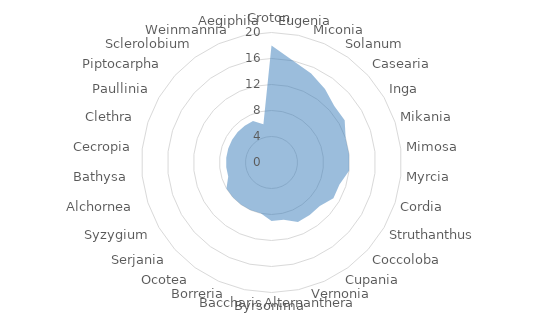
| Category | Series 0 |
|---|---|
| Croton | 18 |
| Eugenia | 16 |
| Miconia | 15 |
| Solanum | 14 |
| Casearia | 13 |
| Inga | 13 |
| Mikania | 12 |
| Mimosa | 12 |
| Myrcia | 12 |
| Cordia | 11 |
| Struthanthus | 11 |
| Coccoloba | 10 |
| Cupania | 10 |
| Vernonia | 10 |
| Alternanthera | 9 |
| Byrsonima | 9 |
| Baccharis | 8 |
| Borreria | 8 |
| Ocotea  | 8 |
| Serjania | 8 |
| Syzygium | 8 |
| Alchornea  | 7 |
| Bathysa  | 7 |
| Cecropia | 7 |
| Clethra  | 7 |
| Paullinia | 7 |
| Piptocarpha  | 7 |
| Sclerolobium  | 7 |
| Weinmannia  | 7 |
| Aegiphila  | 6 |